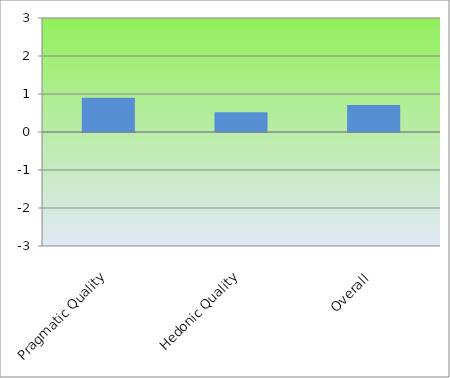
| Category | Series 0 |
|---|---|
| Pragmatic Quality | 0.904 |
| Hedonic Quality | 0.519 |
| Overall | 0.712 |